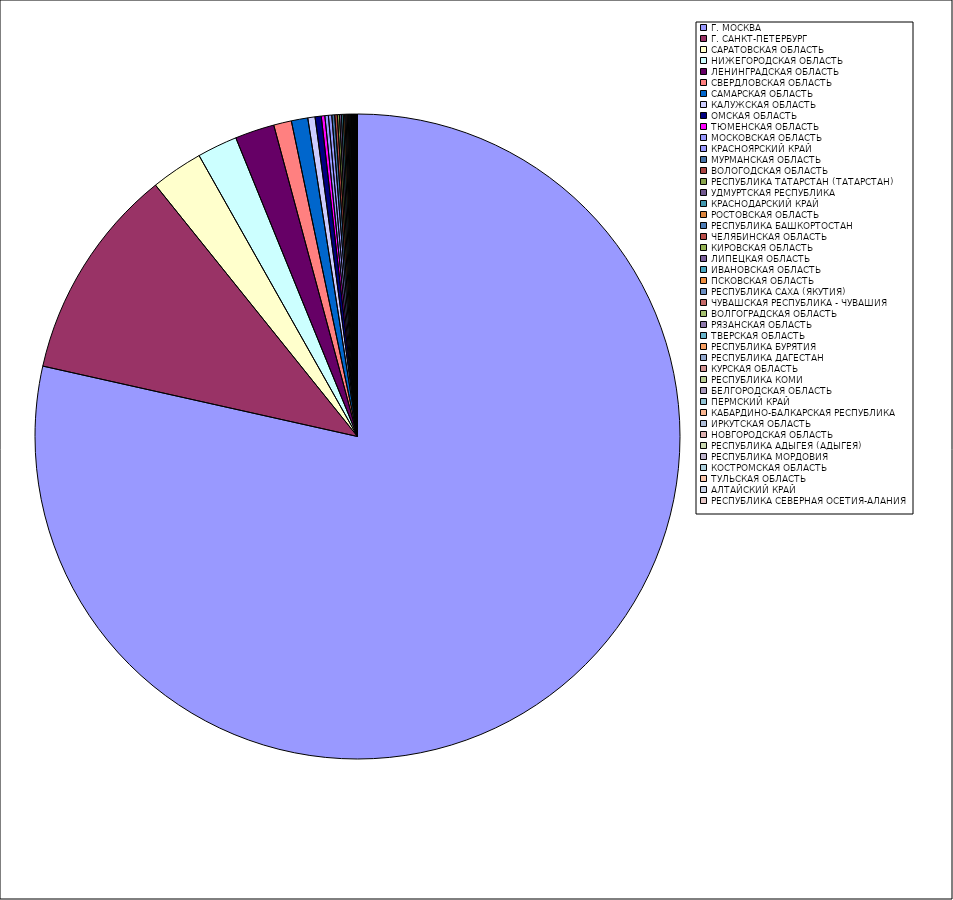
| Category | Оборот |
|---|---|
| Г. МОСКВА | 78.487 |
| Г. САНКТ-ПЕТЕРБУРГ | 10.719 |
| САРАТОВСКАЯ ОБЛАСТЬ | 2.602 |
| НИЖЕГОРОДСКАЯ ОБЛАСТЬ | 2.014 |
| ЛЕНИНГРАДСКАЯ ОБЛАСТЬ | 1.976 |
| СВЕРДЛОВСКАЯ ОБЛАСТЬ | 0.891 |
| САМАРСКАЯ ОБЛАСТЬ | 0.824 |
| КАЛУЖСКАЯ ОБЛАСТЬ | 0.362 |
| ОМСКАЯ ОБЛАСТЬ | 0.31 |
| ТЮМЕНСКАЯ ОБЛАСТЬ | 0.178 |
| МОСКОВСКАЯ ОБЛАСТЬ | 0.174 |
| КРАСНОЯРСКИЙ КРАЙ | 0.17 |
| МУРМАНСКАЯ ОБЛАСТЬ | 0.145 |
| ВОЛОГОДСКАЯ ОБЛАСТЬ | 0.128 |
| РЕСПУБЛИКА ТАТАРСТАН (ТАТАРСТАН) | 0.104 |
| УДМУРТСКАЯ РЕСПУБЛИКА | 0.099 |
| КРАСНОДАРСКИЙ КРАЙ | 0.089 |
| РОСТОВСКАЯ ОБЛАСТЬ | 0.075 |
| РЕСПУБЛИКА БАШКОРТОСТАН | 0.06 |
| ЧЕЛЯБИНСКАЯ ОБЛАСТЬ | 0.059 |
| КИРОВСКАЯ ОБЛАСТЬ | 0.05 |
| ЛИПЕЦКАЯ ОБЛАСТЬ | 0.047 |
| ИВАНОВСКАЯ ОБЛАСТЬ | 0.047 |
| ПСКОВСКАЯ ОБЛАСТЬ | 0.037 |
| РЕСПУБЛИКА САХА (ЯКУТИЯ) | 0.033 |
| ЧУВАШСКАЯ РЕСПУБЛИКА - ЧУВАШИЯ | 0.031 |
| ВОЛГОГРАДСКАЯ ОБЛАСТЬ | 0.029 |
| РЯЗАНСКАЯ ОБЛАСТЬ | 0.023 |
| ТВЕРСКАЯ ОБЛАСТЬ | 0.023 |
| РЕСПУБЛИКА БУРЯТИЯ | 0.021 |
| РЕСПУБЛИКА ДАГЕСТАН | 0.019 |
| КУРСКАЯ ОБЛАСТЬ | 0.019 |
| РЕСПУБЛИКА КОМИ | 0.018 |
| БЕЛГОРОДСКАЯ ОБЛАСТЬ | 0.015 |
| ПЕРМСКИЙ КРАЙ | 0.014 |
| КАБАРДИНО-БАЛКАРСКАЯ РЕСПУБЛИКА | 0.012 |
| ИРКУТСКАЯ ОБЛАСТЬ | 0.011 |
| НОВГОРОДСКАЯ ОБЛАСТЬ | 0.011 |
| РЕСПУБЛИКА АДЫГЕЯ (АДЫГЕЯ) | 0.01 |
| РЕСПУБЛИКА МОРДОВИЯ | 0.01 |
| КОСТРОМСКАЯ ОБЛАСТЬ | 0.009 |
| ТУЛЬСКАЯ ОБЛАСТЬ | 0.009 |
| АЛТАЙСКИЙ КРАЙ | 0.008 |
| РЕСПУБЛИКА СЕВЕРНАЯ ОСЕТИЯ-АЛАНИЯ | 0.006 |